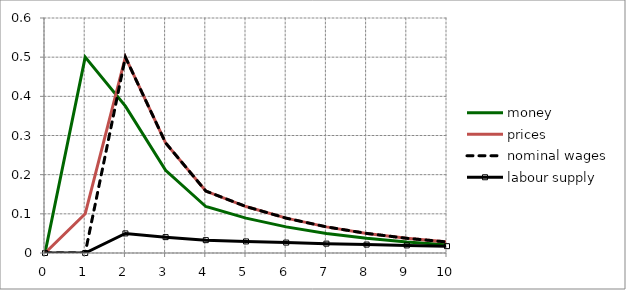
| Category | money | prices | nominal wages | labour supply |
|---|---|---|---|---|
| 0.0 | 0 | 0 | 0 | 0 |
| 1.0 | 0.5 | 0.1 | 0 | 0 |
| 2.0 | 0.375 | 0.5 | 0.5 | 0.05 |
| 3.0 | 0.211 | 0.281 | 0.281 | 0.041 |
| 4.0 | 0.119 | 0.158 | 0.158 | 0.033 |
| 5.0 | 0.089 | 0.119 | 0.119 | 0.03 |
| 6.0 | 0.067 | 0.089 | 0.089 | 0.027 |
| 7.0 | 0.05 | 0.067 | 0.067 | 0.024 |
| 8.0 | 0.038 | 0.05 | 0.05 | 0.022 |
| 9.0 | 0.028 | 0.038 | 0.038 | 0.019 |
| 10.0 | 0.021 | 0.028 | 0.028 | 0.017 |